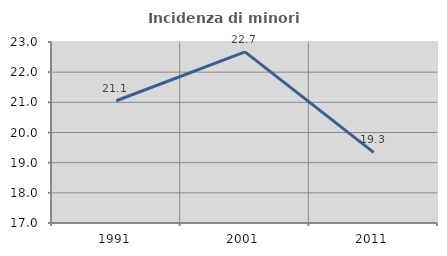
| Category | Incidenza di minori stranieri |
|---|---|
| 1991.0 | 21.053 |
| 2001.0 | 22.674 |
| 2011.0 | 19.342 |